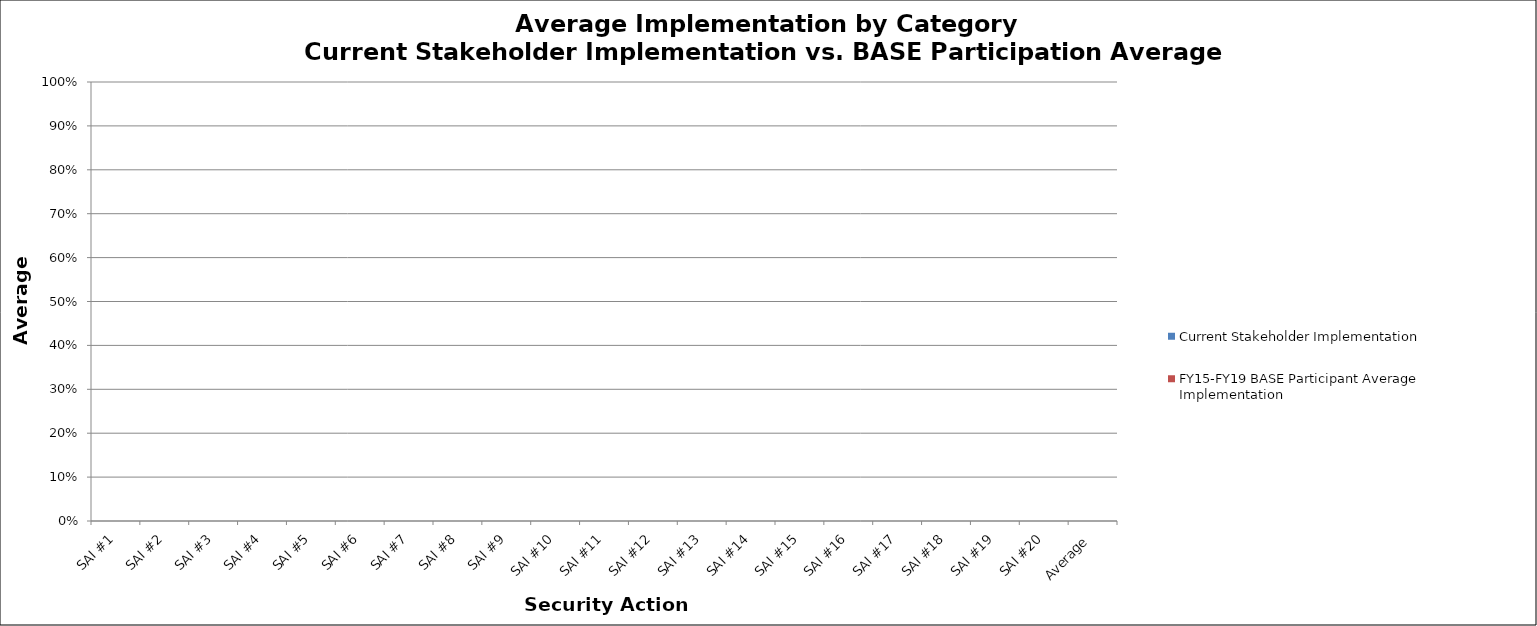
| Category | Current Stakeholder Implementation | FY15-FY19 BASE Participant Average Implementation |
|---|---|---|
| SAI #1 | 0 | 0 |
| SAI #2 | 0 | 0 |
| SAI #3 | 0 | 0 |
| SAI #4 | 0 | 0 |
| SAI #5 | 0 | 0 |
| SAI #6 | 0 | 0 |
| SAI #7 | 0 | 0 |
| SAI #8 | 0 | 0 |
| SAI #9 | 0 | 0 |
| SAI #10 | 0 | 0 |
| SAI #11 | 0 | 0 |
| SAI #12 | 0 | 0 |
| SAI #13 | 0 | 0 |
| SAI #14 | 0 | 0 |
| SAI #15 | 0 | 0 |
| SAI #16 | 0 | 0 |
| SAI #17 | 0 | 0 |
| SAI #18 | 0 | 0 |
| SAI #19 | 0 | 0 |
| SAI #20 | 0 | 0 |
| Average | 0 | 0 |